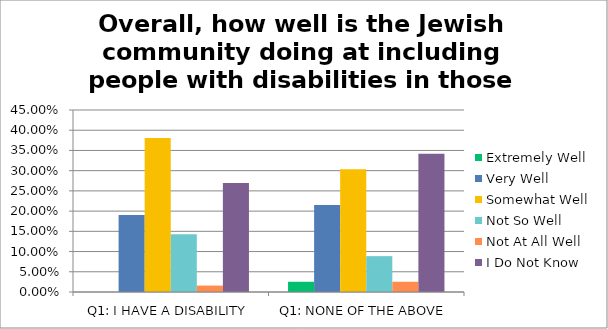
| Category | Extremely Well | Very Well | Somewhat Well | Not So Well | Not At All Well | I Do Not Know |
|---|---|---|---|---|---|---|
| Q1: I HAVE A DISABILITY | 0 | 0.19 | 0.381 | 0.143 | 0.016 | 0.27 |
| Q1: NONE OF THE ABOVE | 0.025 | 0.215 | 0.304 | 0.089 | 0.025 | 0.342 |